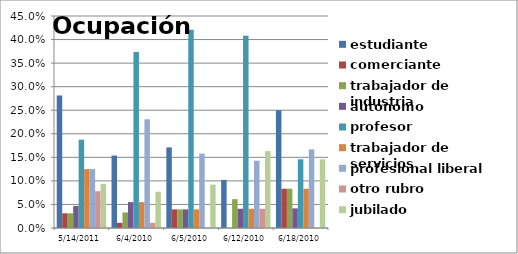
| Category | estudiante | comerciante | trabajador de industria | autónomo | profesor    | trabajador de servicios | profesional liberal | otro rubro | jubilado |
|---|---|---|---|---|---|---|---|---|---|
| 14/05/2011 | 0.281 | 0.031 | 0.031 | 0.047 | 0.188 | 0.125 | 0.125 | 0.078 | 0.094 |
| 04/06/2010 | 0.154 | 0.011 | 0.033 | 0.055 | 0.374 | 0.055 | 0.231 | 0.011 | 0.077 |
| 05/06/2010 | 0.171 | 0.039 | 0.039 | 0.039 | 0.421 | 0.039 | 0.158 | 0 | 0.092 |
| 12/06/2010 | 0.102 | 0 | 0.061 | 0.041 | 0.408 | 0.041 | 0.143 | 0.041 | 0.163 |
| 18/06/2010 | 0.25 | 0.083 | 0.083 | 0.042 | 0.146 | 0.083 | 0.167 | 0 | 0.146 |